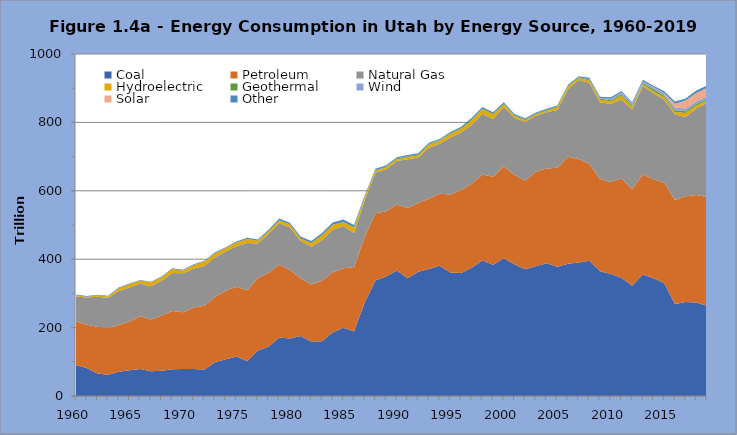
| Category | Coal | Petroleum | Natural Gas | Hydroelectric | Geothermal | Wind | Solar | Other |
|---|---|---|---|---|---|---|---|---|
| 1960.0 | 90.987 | 127.551 | 72.441 | 3.277 | 0 | 0 | 0 | 2.219 |
| 1961.0 | 81.961 | 126.702 | 79.168 | 2.456 | 0 | 0 | 0 | 2.133 |
| 1962.0 | 65.546 | 136.636 | 87.938 | 4.145 | 0 | 0 | 0 | 2.044 |
| 1963.0 | 62.429 | 136.195 | 88.494 | 3.69 | 0 | 0 | 0 | 2.008 |
| 1964.0 | 71.053 | 136.68 | 99.071 | 8.003 | 0 | 0 | 0 | 2.149 |
| 1965.0 | 75.454 | 142.231 | 99.81 | 9.546 | 0 | 0 | 0 | 1.956 |
| 1966.0 | 79.117 | 154.284 | 95.74 | 8.233 | 0 | 0 | 0 | 1.938 |
| 1967.0 | 72.424 | 151.592 | 97.068 | 11.207 | 0 | 0 | 0 | 2.059 |
| 1968.0 | 73.921 | 161.346 | 101.626 | 10.575 | 0 | 0 | 0 | 2.216 |
| 1969.0 | 78.445 | 170.147 | 110.888 | 11.677 | 0 | 0 | 0 | 2.284 |
| 1970.0 | 78.79 | 165.826 | 114.377 | 7.775 | 0 | 0 | 0 | 2.303 |
| 1971.0 | 78.723 | 179.959 | 113.876 | 10.314 | 0 | 0 | 0 | 2.303 |
| 1972.0 | 77.592 | 186.443 | 116.399 | 12.692 | 0 | 0 | 0 | 2.544 |
| 1973.0 | 98.832 | 190.457 | 116.335 | 11.532 | 0 | 0 | 0 | 3.145 |
| 1974.0 | 107.64 | 199.781 | 115.206 | 9.83 | 0 | 0 | 0 | 2.612 |
| 1975.0 | 115.731 | 203.889 | 117.952 | 11.186 | 0 | 0 | 0 | 2.893 |
| 1976.0 | 101.769 | 207.169 | 138.603 | 11.713 | 0 | 0 | 0 | 3.257 |
| 1977.0 | 132.839 | 211.89 | 100.999 | 7.896 | 0 | 0 | 0 | 3.811 |
| 1978.0 | 143.95 | 216.782 | 113.322 | 7.597 | 0 | 0 | 0 | 4.492 |
| 1979.0 | 170.9 | 213.386 | 120.98 | 8.303 | 0 | 0 | 0 | 5.332 |
| 1980.0 | 168.253 | 200.325 | 124.99 | 8.538 | 0 | 0 | 0 | 4.492 |
| 1981.0 | 175.709 | 168.355 | 109.703 | 6.512 | 0 | 0 | 0 | 5.876 |
| 1982.0 | 159.56 | 166.643 | 110.526 | 10.715 | 0 | 0 | 0 | 6.047 |
| 1983.0 | 160.215 | 176.813 | 118.449 | 14.661 | 0 | 0 | 0 | 6.505 |
| 1984.0 | 185.636 | 176.034 | 124.247 | 14.516 | 0.4 | 0 | 0 | 6.705 |
| 1985.0 | 199.366 | 174.052 | 123.75 | 10.646 | 1.144 | 0 | 0 | 6.89 |
| 1986.0 | 188.954 | 188.163 | 99.706 | 14.752 | 1.793 | 0 | 0 | 6.451 |
| 1987.0 | 273.767 | 192.227 | 106.906 | 8.92 | 1.707 | 0 | 0 | 3.636 |
| 1988.0 | 337.985 | 196.678 | 117.778 | 6.124 | 1.799 | 0 | 0 | 3.856 |
| 1989.0 | 349.731 | 190.141 | 123.414 | 5.856 | 2.238 | 0 | 0.034 | 3.544 |
| 1990.0 | 366.819 | 193.227 | 126.913 | 5.294 | 2.003 | 0 | 0.04 | 3.442 |
| 1991.0 | 344.356 | 205.358 | 142.458 | 6.543 | 2.365 | 0 | 0.04 | 3.605 |
| 1992.0 | 363.049 | 201.745 | 132.216 | 6.234 | 2.833 | 0 | 0.04 | 3.762 |
| 1993.0 | 370.982 | 205.769 | 149.088 | 8.866 | 2.341 | 0 | 0.04 | 3.727 |
| 1994.0 | 380.855 | 210.443 | 146.258 | 7.747 | 2.853 | 0 | 0.051 | 3.552 |
| 1995.0 | 361.424 | 227.89 | 166.663 | 9.987 | 2.213 | 0 | 0.051 | 3.58 |
| 1996.0 | 360.004 | 242.309 | 167.792 | 10.846 | 2.788 | 0 | 0.053 | 3.797 |
| 1997.0 | 375.089 | 245.399 | 172.195 | 13.73 | 2.58 | 0 | 0.051 | 4.398 |
| 1998.0 | 396.135 | 251.22 | 177.586 | 13.403 | 2.511 | 0 | 0.049 | 3.889 |
| 1999.0 | 384.047 | 257.263 | 168.684 | 12.836 | 2.424 | 0 | 0.047 | 4.088 |
| 2000.0 | 403.065 | 268.705 | 172.948 | 7.612 | 2.441 | 0 | 0.044 | 4.369 |
| 2001.0 | 384.455 | 261.655 | 167.583 | 5.257 | 2.509 | 0 | 0.041 | 2.703 |
| 2002.0 | 370.557 | 258.56 | 172.366 | 4.654 | 3.117 | 0 | 0.039 | 2.686 |
| 2003.0 | 379.17 | 276.564 | 163.527 | 4.269 | 2.566 | 0 | 0.039 | 2.788 |
| 2004.0 | 387.912 | 277.604 | 164.154 | 4.504 | 2.535 | 0 | 0.037 | 2.816 |
| 2005.0 | 377.952 | 289.745 | 168.771 | 7.849 | 2.501 | 0 | 0.035 | 2.516 |
| 2006.0 | 386.988 | 312.312 | 197.893 | 7.405 | 2.559 | 0 | 0.036 | 2.638 |
| 2007.0 | 390.483 | 302.541 | 231.123 | 5.323 | 2.324 | 0 | 0.04 | 3.069 |
| 2008.0 | 395.433 | 282.948 | 237.414 | 6.584 | 3.298 | 0.235 | 0.045 | 4.448 |
| 2009.0 | 365.082 | 269.307 | 223.646 | 8.155 | 3.49 | 1.552 | 0.058 | 3.847 |
| 2010.0 | 356.729 | 269.011 | 229.078 | 6.78 | 3.448 | 4.365 | 0.081 | 3.995 |
| 2011.0 | 345.848 | 290.137 | 230.672 | 11.954 | 4.029 | 5.563 | 0.113 | 3.592 |
| 2012.0 | 322.077 | 283.338 | 232.63 | 7.114 | 3.99 | 6.697 | 0.2 | 3.058 |
| 2013.0 | 355.252 | 292.666 | 258.661 | 4.818 | 3.851 | 5.148 | 0.283 | 3.739 |
| 2014.0 | 344.054 | 289.356 | 251.649 | 6.016 | 5.765 | 6.276 | 0.436 | 3.359 |
| 2015.0 | 330.043 | 293.424 | 242.848 | 7.162 | 4.808 | 5.832 | 0.979 | 5.726 |
| 2016.0 | 269.016 | 304.274 | 250.199 | 7.008 | 5.288 | 7.594 | 11.165 | 6.884 |
| 2017.0 | 274.816 | 309.569 | 231.151 | 11.916 | 5.239 | 7.909 | 23.098 | 6.357 |
| 2018.0 | 273.117 | 314.364 | 253.819 | 8.441 | 4.865 | 7.23 | 23.893 | 7.896 |
| 2019.0 | 263.72 | 318.537 | 274.61 | 7.963 | 3.633 | 7.45 | 24.714 | 7.308 |